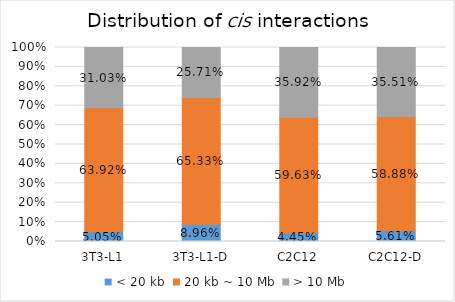
| Category | < 20 kb | 20 kb ~ 10 Mb | > 10 Mb |
|---|---|---|---|
| 3T3-L1 | 0.051 | 0.639 | 0.31 |
| 3T3-L1-D | 0.09 | 0.653 | 0.257 |
| C2C12 | 0.044 | 0.596 | 0.359 |
| C2C12-D | 0.056 | 0.589 | 0.355 |